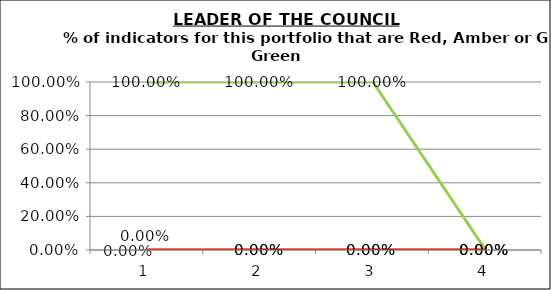
| Category | Green | Amber | Red |
|---|---|---|---|
| 0 | 1 | 0 | 0 |
| 1 | 1 | 0 | 0 |
| 2 | 1 | 0 | 0 |
| 3 | 0 | 0 | 0 |